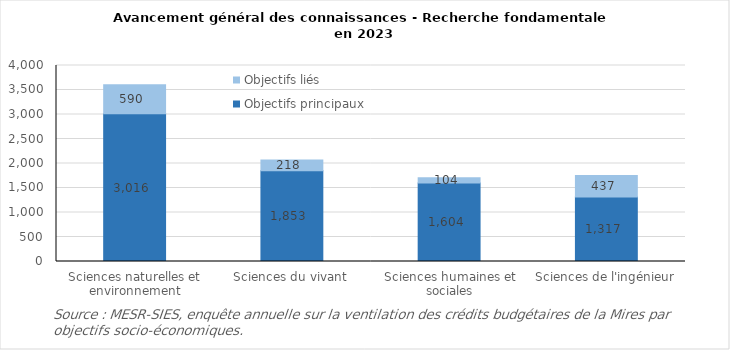
| Category | Objectifs principaux | Objectifs liés |
|---|---|---|
| Sciences naturelles et environnement | 3015.6 | 590.3 |
| Sciences du vivant | 1853.3 | 218.1 |
| Sciences humaines et sociales | 1603.9 | 104.1 |
| Sciences de l'ingénieur | 1316.5 | 437 |